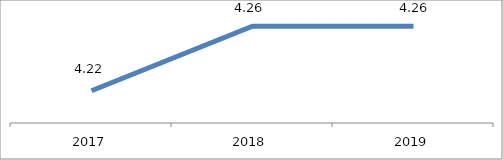
| Category | Engagement des employés |
|---|---|
| 2017.0 | 4.22 |
| 2018.0 | 4.26 |
| 2019.0 | 4.26 |